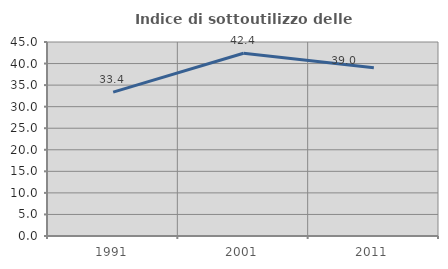
| Category | Indice di sottoutilizzo delle abitazioni  |
|---|---|
| 1991.0 | 33.379 |
| 2001.0 | 42.383 |
| 2011.0 | 39.028 |